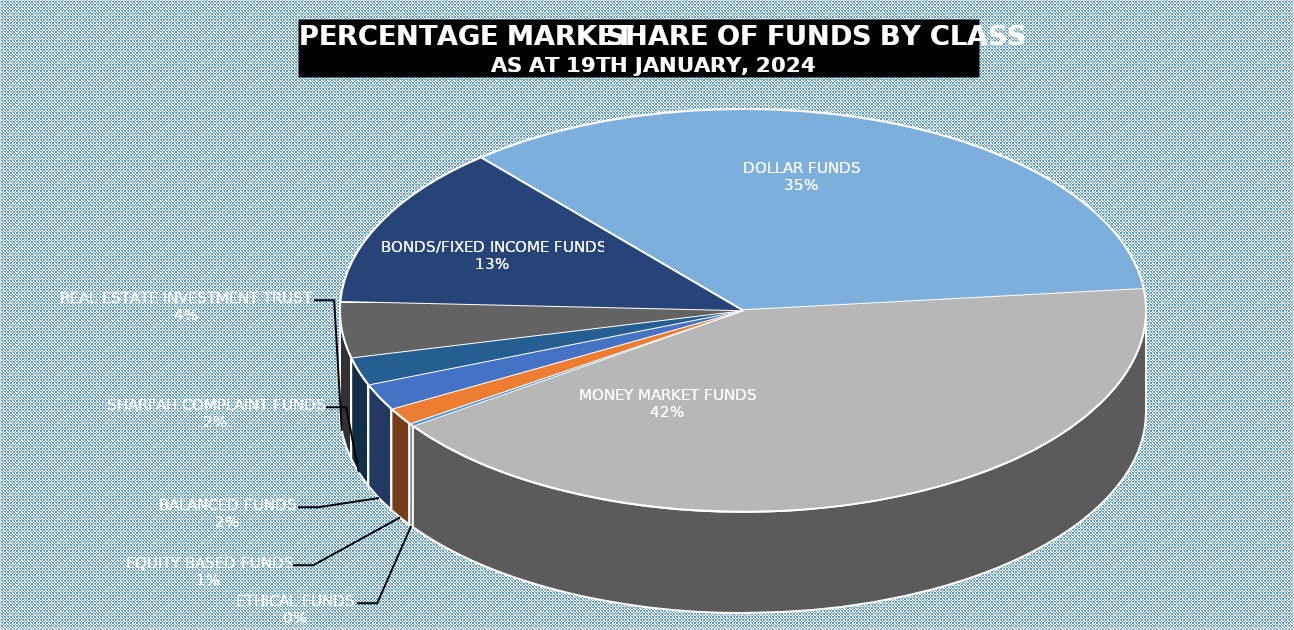
| Category | 19-Jan |
|---|---|
| ETHICAL FUNDS | 5180809308.12 |
| EQUITY BASED FUNDS | 30206984491.495 |
| BALANCED FUNDS | 47060563752.939 |
| SHARI'AH COMPLAINT FUNDS | 49666823038.976 |
| REAL ESTATE INVESTMENT TRUST | 99595668997.223 |
| BONDS/FIXED INCOME FUNDS | 288027196204.475 |
| DOLLAR FUNDS | 765722989499.46 |
| MONEY MARKET FUNDS | 930010368618.945 |